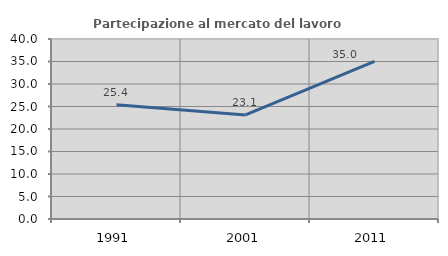
| Category | Partecipazione al mercato del lavoro  femminile |
|---|---|
| 1991.0 | 25.373 |
| 2001.0 | 23.116 |
| 2011.0 | 35.025 |